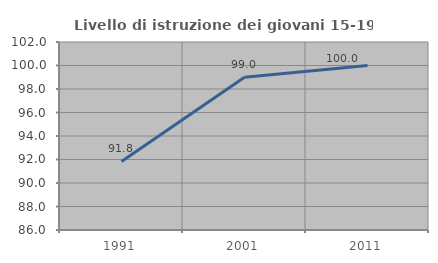
| Category | Livello di istruzione dei giovani 15-19 anni |
|---|---|
| 1991.0 | 91.837 |
| 2001.0 | 99 |
| 2011.0 | 100 |